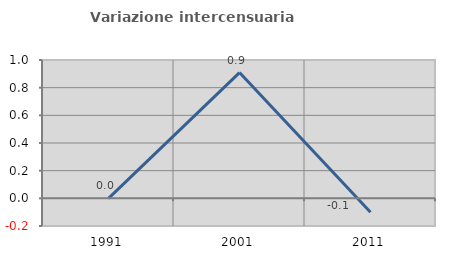
| Category | Variazione intercensuaria annua |
|---|---|
| 1991.0 | 0 |
| 2001.0 | 0.909 |
| 2011.0 | -0.1 |